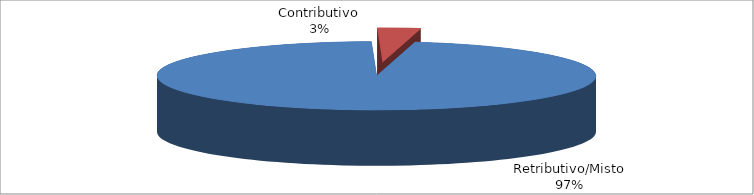
| Category | Series 1 |
|---|---|
| Retributivo/Misto | 38612 |
| Contributivo | 1260 |